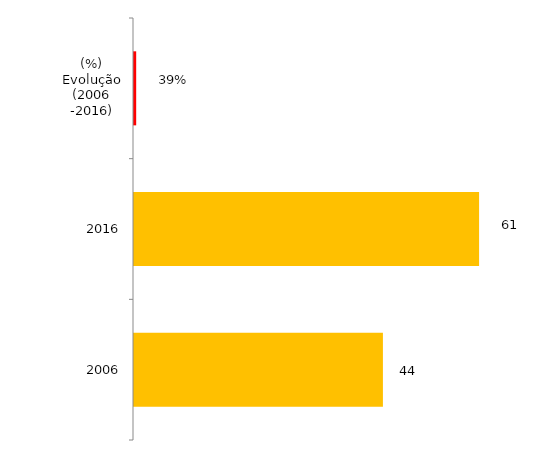
| Category | Estágiarios |
|---|---|
| 2006 | 44 |
| 2016 | 61 |
| (%) Evolução (2006 -2016) | 0.386 |